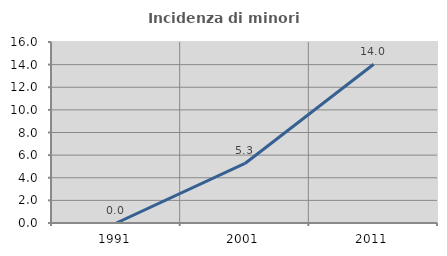
| Category | Incidenza di minori stranieri |
|---|---|
| 1991.0 | 0 |
| 2001.0 | 5.263 |
| 2011.0 | 14.035 |